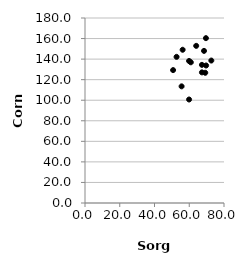
| Category | Series 0 |
|---|---|
| 59.9 | 100.7 |
| 72.7 | 138.6 |
| 55.6 | 113.5 |
| 67.3 | 127.1 |
| 69.2 | 126.7 |
| 67.3 | 134.4 |
| 69.7 | 133.8 |
| 60.9 | 136.9 |
| 59.9 | 138.2 |
| 50.7 | 129.3 |
| 52.7 | 142.2 |
| 69.6 | 160.4 |
| 68.5 | 148 |
| 56.2 | 149.1 |
| 64.0 | 152.9 |